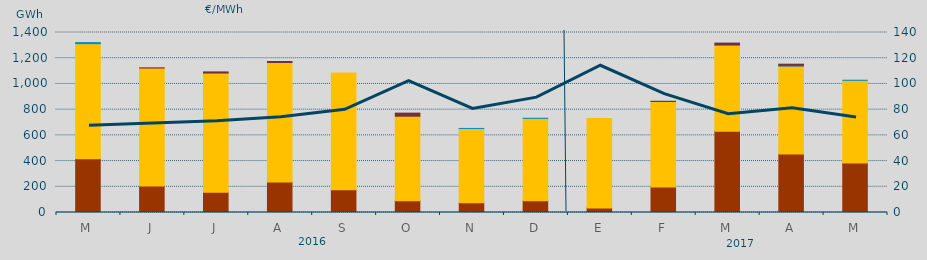
| Category | Carbón | Ciclo Combinado | Hidráulica | Nuclear | Consumo Bombeo |
|---|---|---|---|---|---|
| M | 418905 | 894330.4 | 8664.2 | 0 | 0 |
| J | 206083.6 | 917663.8 | 0 | 0 | 1217 |
| J | 157445 | 927968.4 | 544 | 0 | 7584 |
| A | 238113.9 | 928531.9 | 0 | 0 | 7932.8 |
| S | 177358.6 | 907062.2 | 0 | 0 | 0 |
| O | 91594.1 | 657310.6 | 0 | 0 | 23959.3 |
| N | 76065.2 | 577468 | 240 | 0 | 0 |
| D | 91091.6 | 640964.5 | 1160 | 0 | 0 |
| E | 35729 | 696156.2 | 0 | 0 | 0 |
| F | 198516.2 | 665095.2 | 712.6 | 0 | 139.6 |
| M | 631868 | 670791.6 | 1411.7 | 0 | 13667.9 |
| A | 454829.4 | 684899.6 | 1412 | 9600 | 2812.1 |
| M | 384999.4 | 642959.4 | 538 | 0 | 0 |